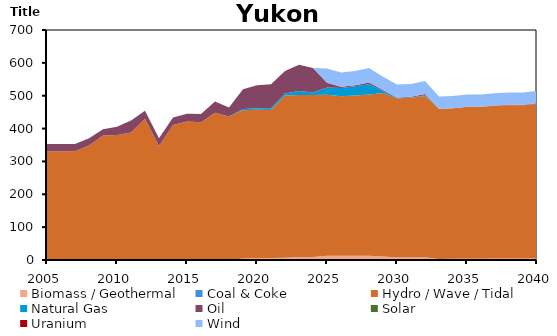
| Category | Biomass / Geothermal | Coal & Coke | Hydro / Wave / Tidal | Natural Gas | Oil | Solar | Uranium | Wind |
|---|---|---|---|---|---|---|---|---|
| 2005.0 | 0 | 0 | 330.633 | 0 | 22.094 | 0 | 0 | 0.407 |
| 2006.0 | 0 | 0 | 330.633 | 0 | 22.094 | 0 | 0 | 0.407 |
| 2007.0 | 0 | 0 | 330.633 | 0 | 22.094 | 0 | 0 | 0.407 |
| 2008.0 | 0 | 0 | 348.294 | 0 | 22.331 | 0 | 0 | 0.437 |
| 2009.0 | 0 | 0 | 379.056 | 0 | 18.542 | 0 | 0 | 0.228 |
| 2010.0 | 0 | 0 | 380.431 | 0 | 24.783 | 0 | 0 | 0.085 |
| 2011.0 | 0 | 0 | 388.067 | 0 | 36.868 | 0 | 0 | 0.402 |
| 2012.0 | 0 | 0 | 430.194 | 0 | 24.365 | 0 | 0 | 0.445 |
| 2013.0 | 0 | 0 | 347.187 | 0 | 23.291 | 0 | 0 | 0.277 |
| 2014.0 | 0 | 0 | 410.668 | 0 | 23 | 0 | 0 | 0.334 |
| 2015.0 | 0 | 0 | 421.696 | 0 | 23.783 | 0 | 0 | 0.65 |
| 2016.0 | 0 | 0 | 419.461 | 0 | 24.698 | 0 | 0 | 0.509 |
| 2017.0 | 0 | 0 | 448.151 | 0 | 33.966 | 0 | 0 | 0.033 |
| 2018.0 | 0 | 0 | 437.013 | 0 | 27.238 | 0 | 0 | 0.032 |
| 2019.0 | 4.625 | 0 | 451.464 | 3.584 | 60.295 | 0 | 0 | 0.033 |
| 2020.0 | 6.304 | 0 | 450.81 | 5.02 | 69.881 | 0 | 0 | 0.033 |
| 2021.0 | 6.367 | 0 | 450.264 | 5.468 | 72.975 | 0 | 0 | 0.033 |
| 2022.0 | 7.209 | 0 | 493.44 | 5.893 | 68.876 | 0 | 0 | 0.033 |
| 2023.0 | 9.11 | 0 | 493.085 | 11.991 | 80.019 | 0 | 0 | 0.033 |
| 2024.0 | 9.11 | 0 | 492.81 | 7.574 | 74.684 | 0 | 0 | 0.033 |
| 2025.0 | 12.599 | 0 | 490.527 | 21.775 | 14.347 | 0 | 0 | 43.646 |
| 2026.0 | 12.564 | 0 | 485.505 | 25.772 | 3.329 | 0 | 0 | 43.204 |
| 2027.0 | 12.584 | 0 | 488.037 | 28.027 | 3.355 | 0 | 0 | 43.449 |
| 2028.0 | 12.892 | 0 | 490.451 | 31.359 | 5.832 | 0 | 0 | 43.677 |
| 2029.0 | 10.311 | 0 | 498.11 | 5.753 | 3.329 | 0 | 0 | 40.384 |
| 2030.0 | 7.569 | 0 | 485.062 | 0.895 | 1.405 | 0 | 0 | 39.223 |
| 2031.0 | 7.945 | 0 | 485.946 | 1.021 | 1.615 | 0 | 0 | 39.288 |
| 2032.0 | 8.538 | 0 | 490.933 | 2.273 | 3.297 | 0 | 0 | 39.752 |
| 2033.0 | 3.345 | 0 | 456.653 | 0 | 0.499 | 0 | 0 | 36.773 |
| 2034.0 | 3.542 | 0 | 457.977 | 0 | 0.587 | 0 | 0 | 36.875 |
| 2035.0 | 3.794 | 0 | 461.55 | 0 | 0.82 | 0 | 0 | 37.202 |
| 2036.0 | 4.026 | 0 | 461.623 | 0 | 0.771 | 0 | 0 | 37.208 |
| 2037.0 | 4.238 | 0 | 465.016 | 0 | 1.13 | 0 | 0 | 37.488 |
| 2038.0 | 4.75 | 0 | 466.069 | 0 | 1.332 | 0 | 0 | 37.56 |
| 2039.0 | 4.752 | 0 | 466.139 | 0.01 | 1.332 | 0 | 0 | 37.565 |
| 2040.0 | 5.742 | 0 | 469.566 | 0.048 | 1.332 | 0 | 0 | 37.893 |